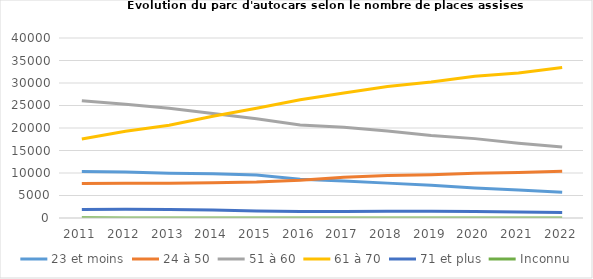
| Category | 23 et moins | 24 à 50 | 51 à 60 | 61 à 70 | 71 et plus | Inconnu |
|---|---|---|---|---|---|---|
| 2011.0 | 10311 | 7656 | 26054 | 17552 | 1898 | 67 |
| 2012.0 | 10226 | 7744 | 25280 | 19277 | 1969 | 11 |
| 2013.0 | 9929 | 7734 | 24397 | 20595 | 1899 | 8 |
| 2014.0 | 9845 | 7849 | 23217 | 22628 | 1765 | 9 |
| 2015.0 | 9540 | 7984 | 22053 | 24390 | 1564 | 8 |
| 2016.0 | 8610 | 8392 | 20663 | 26265 | 1417 | 9 |
| 2017.0 | 8196 | 9043 | 20148 | 27800 | 1459 | 12 |
| 2018.0 | 7750 | 9438 | 19347 | 29197 | 1504 | 13 |
| 2019.0 | 7255 | 9622 | 18352 | 30226 | 1505 | 12 |
| 2020.0 | 6692 | 9967 | 17640 | 31489 | 1461 | 9 |
| 2021.0 | 6207 | 10097 | 16634 | 32247 | 1326 | 8 |
| 2022.0 | 5740 | 10364 | 15800 | 33446 | 1238 | 8 |